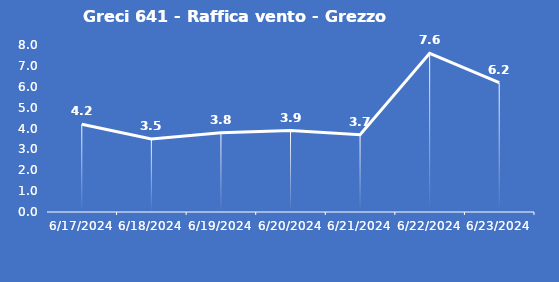
| Category | Greci 641 - Raffica vento - Grezzo (m/s) |
|---|---|
| 6/17/24 | 4.2 |
| 6/18/24 | 3.5 |
| 6/19/24 | 3.8 |
| 6/20/24 | 3.9 |
| 6/21/24 | 3.7 |
| 6/22/24 | 7.6 |
| 6/23/24 | 6.2 |